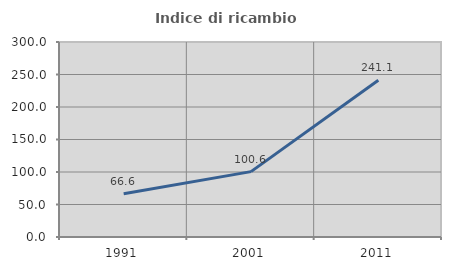
| Category | Indice di ricambio occupazionale  |
|---|---|
| 1991.0 | 66.608 |
| 2001.0 | 100.571 |
| 2011.0 | 241.148 |